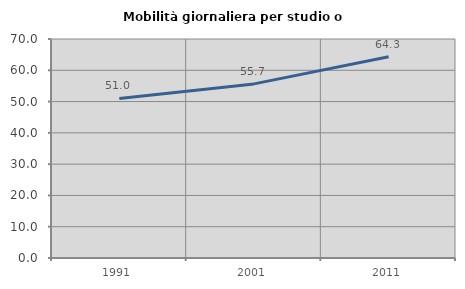
| Category | Mobilità giornaliera per studio o lavoro |
|---|---|
| 1991.0 | 50.997 |
| 2001.0 | 55.652 |
| 2011.0 | 64.341 |